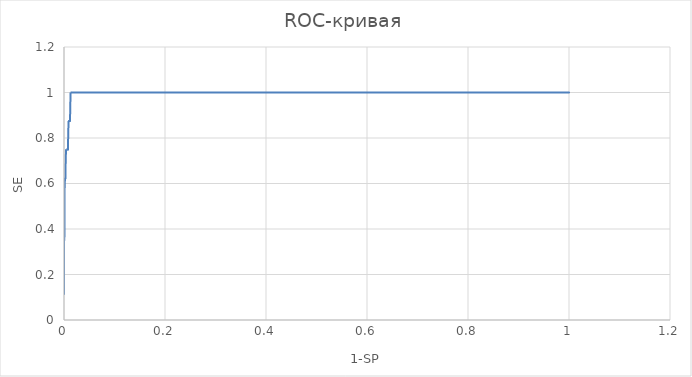
| Category | SE |
|---|---|
| 0.0 | 0.111 |
| 0.0 | 0.222 |
| 0.0 | 0.333 |
| 0.0010000000000000009 | 0.375 |
| 0.0010000000000000009 | 0.444 |
| 0.0010000000000000009 | 0.556 |
| 0.0020000000000000018 | 0.625 |
| 0.0030000000000000027 | 0.625 |
| 0.0030000000000000027 | 0.625 |
| 0.0030000000000000027 | 0.667 |
| 0.0040000000000000036 | 0.75 |
| 0.0050000000000000044 | 0.75 |
| 0.006000000000000005 | 0.75 |
| 0.007000000000000006 | 0.75 |
| 0.008000000000000007 | 0.75 |
| 0.008000000000000007 | 0.778 |
| 0.009000000000000008 | 0.875 |
| 0.010000000000000009 | 0.875 |
| 0.010000000000000009 | 0.875 |
| 0.01100000000000001 | 0.875 |
| 0.01200000000000001 | 0.875 |
| 0.01200000000000001 | 0.889 |
| 0.013000000000000012 | 1 |
| 0.014000000000000012 | 1 |
| 0.015000000000000013 | 1 |
| 0.016000000000000014 | 1 |
| 0.016000000000000014 | 1 |
| 0.017000000000000015 | 1 |
| 0.018000000000000016 | 1 |
| 0.019000000000000017 | 1 |
| 0.020000000000000018 | 1 |
| 0.02100000000000002 | 1 |
| 0.02200000000000002 | 1 |
| 0.02200000000000002 | 1 |
| 0.02300000000000002 | 1 |
| 0.02400000000000002 | 1 |
| 0.025000000000000022 | 1 |
| 0.026000000000000023 | 1 |
| 0.027000000000000024 | 1 |
| 0.028000000000000025 | 1 |
| 0.029000000000000026 | 1 |
| 0.029000000000000026 | 1 |
| 0.030000000000000027 | 1 |
| 0.031000000000000028 | 1 |
| 0.03200000000000003 | 1 |
| 0.03300000000000003 | 1 |
| 0.03400000000000003 | 1 |
| 0.03500000000000003 | 1 |
| 0.03500000000000003 | 1 |
| 0.03600000000000003 | 1 |
| 0.03700000000000003 | 1 |
| 0.038000000000000034 | 1 |
| 0.039000000000000035 | 1 |
| 0.040000000000000036 | 1 |
| 0.041000000000000036 | 1 |
| 0.041000000000000036 | 1 |
| 0.04200000000000004 | 1 |
| 0.04300000000000004 | 1 |
| 0.04400000000000004 | 1 |
| 0.04500000000000004 | 1 |
| 0.04600000000000004 | 1 |
| 0.04700000000000004 | 1 |
| 0.04800000000000004 | 1 |
| 0.04800000000000004 | 1 |
| 0.049000000000000044 | 1 |
| 0.050000000000000044 | 1 |
| 0.051000000000000045 | 1 |
| 0.052000000000000046 | 1 |
| 0.05300000000000005 | 1 |
| 0.05400000000000005 | 1 |
| 0.05400000000000005 | 1 |
| 0.05500000000000005 | 1 |
| 0.05600000000000005 | 1 |
| 0.05700000000000005 | 1 |
| 0.05800000000000005 | 1 |
| 0.05900000000000005 | 1 |
| 0.06000000000000005 | 1 |
| 0.061000000000000054 | 1 |
| 0.061000000000000054 | 1 |
| 0.062000000000000055 | 1 |
| 0.06299999999999994 | 1 |
| 0.06399999999999995 | 1 |
| 0.06499999999999995 | 1 |
| 0.06599999999999995 | 1 |
| 0.06699999999999995 | 1 |
| 0.06699999999999995 | 1 |
| 0.06799999999999995 | 1 |
| 0.06899999999999995 | 1 |
| 0.06999999999999995 | 1 |
| 0.07099999999999995 | 1 |
| 0.07199999999999995 | 1 |
| 0.07299999999999995 | 1 |
| 0.07299999999999995 | 1 |
| 0.07399999999999995 | 1 |
| 0.07499999999999996 | 1 |
| 0.07599999999999996 | 1 |
| 0.07699999999999996 | 1 |
| 0.07799999999999996 | 1 |
| 0.07899999999999996 | 1 |
| 0.07999999999999996 | 1 |
| 0.07999999999999996 | 1 |
| 0.08099999999999996 | 1 |
| 0.08199999999999996 | 1 |
| 0.08299999999999996 | 1 |
| 0.08399999999999996 | 1 |
| 0.08499999999999996 | 1 |
| 0.08599999999999997 | 1 |
| 0.08599999999999997 | 1 |
| 0.08699999999999997 | 1 |
| 0.08799999999999997 | 1 |
| 0.08899999999999997 | 1 |
| 0.08999999999999997 | 1 |
| 0.09099999999999997 | 1 |
| 0.09199999999999997 | 1 |
| 0.09199999999999997 | 1 |
| 0.09299999999999997 | 1 |
| 0.09399999999999997 | 1 |
| 0.09499999999999997 | 1 |
| 0.09599999999999997 | 1 |
| 0.09699999999999998 | 1 |
| 0.09799999999999998 | 1 |
| 0.09899999999999998 | 1 |
| 0.09899999999999998 | 1 |
| 0.09999999999999998 | 1 |
| 0.10099999999999998 | 1 |
| 0.10199999999999998 | 1 |
| 0.10299999999999998 | 1 |
| 0.10399999999999998 | 1 |
| 0.10499999999999998 | 1 |
| 0.10499999999999998 | 1 |
| 0.10599999999999998 | 1 |
| 0.10699999999999998 | 1 |
| 0.10799999999999998 | 1 |
| 0.10899999999999999 | 1 |
| 0.10999999999999999 | 1 |
| 0.11099999999999999 | 1 |
| 0.11099999999999999 | 1 |
| 0.11199999999999999 | 1 |
| 0.11299999999999999 | 1 |
| 0.11399999999999999 | 1 |
| 0.11499999999999999 | 1 |
| 0.11599999999999999 | 1 |
| 0.11699999999999999 | 1 |
| 0.118 | 1 |
| 0.118 | 1 |
| 0.119 | 1 |
| 0.12 | 1 |
| 0.121 | 1 |
| 0.122 | 1 |
| 0.123 | 1 |
| 0.124 | 1 |
| 0.124 | 1 |
| 0.125 | 1 |
| 0.126 | 1 |
| 0.127 | 1 |
| 0.128 | 1 |
| 0.129 | 1 |
| 0.13 | 1 |
| 0.131 | 1 |
| 0.131 | 1 |
| 0.132 | 1 |
| 0.133 | 1 |
| 0.134 | 1 |
| 0.135 | 1 |
| 0.136 | 1 |
| 0.137 | 1 |
| 0.137 | 1 |
| 0.138 | 1 |
| 0.139 | 1 |
| 0.14 | 1 |
| 0.14100000000000001 | 1 |
| 0.14200000000000002 | 1 |
| 0.14300000000000002 | 1 |
| 0.14300000000000002 | 1 |
| 0.14400000000000002 | 1 |
| 0.14500000000000002 | 1 |
| 0.14600000000000002 | 1 |
| 0.14700000000000002 | 1 |
| 0.14800000000000002 | 1 |
| 0.14900000000000002 | 1 |
| 0.15000000000000002 | 1 |
| 0.15000000000000002 | 1 |
| 0.15100000000000002 | 1 |
| 0.15200000000000002 | 1 |
| 0.15300000000000002 | 1 |
| 0.15400000000000003 | 1 |
| 0.15500000000000003 | 1 |
| 0.15600000000000003 | 1 |
| 0.15600000000000003 | 1 |
| 0.15700000000000003 | 1 |
| 0.15800000000000003 | 1 |
| 0.15900000000000003 | 1 |
| 0.16000000000000003 | 1 |
| 0.16100000000000003 | 1 |
| 0.16200000000000003 | 1 |
| 0.16200000000000003 | 1 |
| 0.16300000000000003 | 1 |
| 0.16400000000000003 | 1 |
| 0.16500000000000004 | 1 |
| 0.16600000000000004 | 1 |
| 0.16700000000000004 | 1 |
| 0.16800000000000004 | 1 |
| 0.16900000000000004 | 1 |
| 0.16900000000000004 | 1 |
| 0.17000000000000004 | 1 |
| 0.17100000000000004 | 1 |
| 0.17200000000000004 | 1 |
| 0.17300000000000004 | 1 |
| 0.17400000000000004 | 1 |
| 0.17500000000000004 | 1 |
| 0.17500000000000004 | 1 |
| 0.17600000000000005 | 1 |
| 0.17700000000000005 | 1 |
| 0.17800000000000005 | 1 |
| 0.17900000000000005 | 1 |
| 0.18000000000000005 | 1 |
| 0.18100000000000005 | 1 |
| 0.18200000000000005 | 1 |
| 0.18200000000000005 | 1 |
| 0.18300000000000005 | 1 |
| 0.18400000000000005 | 1 |
| 0.18500000000000005 | 1 |
| 0.18600000000000005 | 1 |
| 0.18700000000000006 | 1 |
| 0.18799999999999994 | 1 |
| 0.18799999999999994 | 1 |
| 0.18899999999999995 | 1 |
| 0.18999999999999995 | 1 |
| 0.19099999999999995 | 1 |
| 0.19199999999999995 | 1 |
| 0.19299999999999995 | 1 |
| 0.19399999999999995 | 1 |
| 0.19399999999999995 | 1 |
| 0.19499999999999995 | 1 |
| 0.19599999999999995 | 1 |
| 0.19699999999999995 | 1 |
| 0.19799999999999995 | 1 |
| 0.19899999999999995 | 1 |
| 0.19999999999999996 | 1 |
| 0.20099999999999996 | 1 |
| 0.20099999999999996 | 1 |
| 0.20199999999999996 | 1 |
| 0.20299999999999996 | 1 |
| 0.20399999999999996 | 1 |
| 0.20499999999999996 | 1 |
| 0.20599999999999996 | 1 |
| 0.20699999999999996 | 1 |
| 0.20699999999999996 | 1 |
| 0.20799999999999996 | 1 |
| 0.20899999999999996 | 1 |
| 0.20999999999999996 | 1 |
| 0.21099999999999997 | 1 |
| 0.21199999999999997 | 1 |
| 0.21299999999999997 | 1 |
| 0.21299999999999997 | 1 |
| 0.21399999999999997 | 1 |
| 0.21499999999999997 | 1 |
| 0.21599999999999997 | 1 |
| 0.21699999999999997 | 1 |
| 0.21799999999999997 | 1 |
| 0.21899999999999997 | 1 |
| 0.21999999999999997 | 1 |
| 0.21999999999999997 | 1 |
| 0.22099999999999997 | 1 |
| 0.22199999999999998 | 1 |
| 0.22299999999999998 | 1 |
| 0.22399999999999998 | 1 |
| 0.22499999999999998 | 1 |
| 0.22599999999999998 | 1 |
| 0.22599999999999998 | 1 |
| 0.22699999999999998 | 1 |
| 0.22799999999999998 | 1 |
| 0.22899999999999998 | 1 |
| 0.22999999999999998 | 1 |
| 0.23099999999999998 | 1 |
| 0.23199999999999998 | 1 |
| 0.23199999999999998 | 1 |
| 0.23299999999999998 | 1 |
| 0.23399999999999999 | 1 |
| 0.235 | 1 |
| 0.236 | 1 |
| 0.237 | 1 |
| 0.238 | 1 |
| 0.239 | 1 |
| 0.239 | 1 |
| 0.24 | 1 |
| 0.241 | 1 |
| 0.242 | 1 |
| 0.243 | 1 |
| 0.244 | 1 |
| 0.245 | 1 |
| 0.245 | 1 |
| 0.246 | 1 |
| 0.247 | 1 |
| 0.248 | 1 |
| 0.249 | 1 |
| 0.25 | 1 |
| 0.251 | 1 |
| 0.252 | 1 |
| 0.252 | 1 |
| 0.253 | 1 |
| 0.254 | 1 |
| 0.255 | 1 |
| 0.256 | 1 |
| 0.257 | 1 |
| 0.258 | 1 |
| 0.258 | 1 |
| 0.259 | 1 |
| 0.26 | 1 |
| 0.261 | 1 |
| 0.262 | 1 |
| 0.263 | 1 |
| 0.264 | 1 |
| 0.264 | 1 |
| 0.265 | 1 |
| 0.266 | 1 |
| 0.267 | 1 |
| 0.268 | 1 |
| 0.269 | 1 |
| 0.27 | 1 |
| 0.271 | 1 |
| 0.271 | 1 |
| 0.272 | 1 |
| 0.273 | 1 |
| 0.274 | 1 |
| 0.275 | 1 |
| 0.276 | 1 |
| 0.277 | 1 |
| 0.277 | 1 |
| 0.278 | 1 |
| 0.279 | 1 |
| 0.28 | 1 |
| 0.281 | 1 |
| 0.28200000000000003 | 1 |
| 0.28300000000000003 | 1 |
| 0.28300000000000003 | 1 |
| 0.28400000000000003 | 1 |
| 0.28500000000000003 | 1 |
| 0.28600000000000003 | 1 |
| 0.28700000000000003 | 1 |
| 0.28800000000000003 | 1 |
| 0.28900000000000003 | 1 |
| 0.29000000000000004 | 1 |
| 0.29000000000000004 | 1 |
| 0.29100000000000004 | 1 |
| 0.29200000000000004 | 1 |
| 0.29300000000000004 | 1 |
| 0.29400000000000004 | 1 |
| 0.29500000000000004 | 1 |
| 0.29600000000000004 | 1 |
| 0.29600000000000004 | 1 |
| 0.29700000000000004 | 1 |
| 0.29800000000000004 | 1 |
| 0.29900000000000004 | 1 |
| 0.30000000000000004 | 1 |
| 0.30100000000000005 | 1 |
| 0.30200000000000005 | 1 |
| 0.30300000000000005 | 1 |
| 0.30300000000000005 | 1 |
| 0.30400000000000005 | 1 |
| 0.30500000000000005 | 1 |
| 0.30600000000000005 | 1 |
| 0.30700000000000005 | 1 |
| 0.30800000000000005 | 1 |
| 0.30900000000000005 | 1 |
| 0.30900000000000005 | 1 |
| 0.31000000000000005 | 1 |
| 0.31100000000000005 | 1 |
| 0.31200000000000006 | 1 |
| 0.31299999999999994 | 1 |
| 0.31399999999999995 | 1 |
| 0.31499999999999995 | 1 |
| 0.31499999999999995 | 1 |
| 0.31599999999999995 | 1 |
| 0.31699999999999995 | 1 |
| 0.31799999999999995 | 1 |
| 0.31899999999999995 | 1 |
| 0.31999999999999995 | 1 |
| 0.32099999999999995 | 1 |
| 0.32199999999999995 | 1 |
| 0.32199999999999995 | 1 |
| 0.32299999999999995 | 1 |
| 0.32399999999999995 | 1 |
| 0.32499999999999996 | 1 |
| 0.32599999999999996 | 1 |
| 0.32699999999999996 | 1 |
| 0.32799999999999996 | 1 |
| 0.32799999999999996 | 1 |
| 0.32899999999999996 | 1 |
| 0.32999999999999996 | 1 |
| 0.33099999999999996 | 1 |
| 0.33199999999999996 | 1 |
| 0.33299999999999996 | 1 |
| 0.33399999999999996 | 1 |
| 0.33399999999999996 | 1 |
| 0.33499999999999996 | 1 |
| 0.33599999999999997 | 1 |
| 0.33699999999999997 | 1 |
| 0.33799999999999997 | 1 |
| 0.33899999999999997 | 1 |
| 0.33999999999999997 | 1 |
| 0.34099999999999997 | 1 |
| 0.34099999999999997 | 1 |
| 0.34199999999999997 | 1 |
| 0.34299999999999997 | 1 |
| 0.344 | 1 |
| 0.345 | 1 |
| 0.346 | 1 |
| 0.347 | 1 |
| 0.347 | 1 |
| 0.348 | 1 |
| 0.349 | 1 |
| 0.35 | 1 |
| 0.351 | 1 |
| 0.352 | 1 |
| 0.353 | 1 |
| 0.354 | 1 |
| 0.354 | 1 |
| 0.355 | 1 |
| 0.356 | 1 |
| 0.357 | 1 |
| 0.358 | 1 |
| 0.359 | 1 |
| 0.36 | 1 |
| 0.36 | 1 |
| 0.361 | 1 |
| 0.362 | 1 |
| 0.363 | 1 |
| 0.364 | 1 |
| 0.365 | 1 |
| 0.366 | 1 |
| 0.366 | 1 |
| 0.367 | 1 |
| 0.368 | 1 |
| 0.369 | 1 |
| 0.37 | 1 |
| 0.371 | 1 |
| 0.372 | 1 |
| 0.373 | 1 |
| 0.373 | 1 |
| 0.374 | 1 |
| 0.375 | 1 |
| 0.376 | 1 |
| 0.377 | 1 |
| 0.378 | 1 |
| 0.379 | 1 |
| 0.379 | 1 |
| 0.38 | 1 |
| 0.381 | 1 |
| 0.382 | 1 |
| 0.383 | 1 |
| 0.384 | 1 |
| 0.385 | 1 |
| 0.385 | 1 |
| 0.386 | 1 |
| 0.387 | 1 |
| 0.388 | 1 |
| 0.389 | 1 |
| 0.39 | 1 |
| 0.391 | 1 |
| 0.392 | 1 |
| 0.392 | 1 |
| 0.393 | 1 |
| 0.394 | 1 |
| 0.395 | 1 |
| 0.396 | 1 |
| 0.397 | 1 |
| 0.398 | 1 |
| 0.398 | 1 |
| 0.399 | 1 |
| 0.4 | 1 |
| 0.401 | 1 |
| 0.402 | 1 |
| 0.403 | 1 |
| 0.404 | 1 |
| 0.404 | 1 |
| 0.405 | 1 |
| 0.406 | 1 |
| 0.40700000000000003 | 1 |
| 0.40800000000000003 | 1 |
| 0.40900000000000003 | 1 |
| 0.41000000000000003 | 1 |
| 0.41100000000000003 | 1 |
| 0.41100000000000003 | 1 |
| 0.41200000000000003 | 1 |
| 0.41300000000000003 | 1 |
| 0.41400000000000003 | 1 |
| 0.41500000000000004 | 1 |
| 0.41600000000000004 | 1 |
| 0.41700000000000004 | 1 |
| 0.41700000000000004 | 1 |
| 0.41800000000000004 | 1 |
| 0.41900000000000004 | 1 |
| 0.42000000000000004 | 1 |
| 0.42100000000000004 | 1 |
| 0.42200000000000004 | 1 |
| 0.42300000000000004 | 1 |
| 0.42400000000000004 | 1 |
| 0.42400000000000004 | 1 |
| 0.42500000000000004 | 1 |
| 0.42600000000000005 | 1 |
| 0.42700000000000005 | 1 |
| 0.42800000000000005 | 1 |
| 0.42900000000000005 | 1 |
| 0.43000000000000005 | 1 |
| 0.43000000000000005 | 1 |
| 0.43100000000000005 | 1 |
| 0.43200000000000005 | 1 |
| 0.43300000000000005 | 1 |
| 0.43400000000000005 | 1 |
| 0.43500000000000005 | 1 |
| 0.43600000000000005 | 1 |
| 0.43600000000000005 | 1 |
| 0.43700000000000006 | 1 |
| 0.43799999999999994 | 1 |
| 0.43899999999999995 | 1 |
| 0.43999999999999995 | 1 |
| 0.44099999999999995 | 1 |
| 0.44199999999999995 | 1 |
| 0.44299999999999995 | 1 |
| 0.44299999999999995 | 1 |
| 0.44399999999999995 | 1 |
| 0.44499999999999995 | 1 |
| 0.44599999999999995 | 1 |
| 0.44699999999999995 | 1 |
| 0.44799999999999995 | 1 |
| 0.44899999999999995 | 1 |
| 0.44899999999999995 | 1 |
| 0.44999999999999996 | 1 |
| 0.45099999999999996 | 1 |
| 0.45199999999999996 | 1 |
| 0.45299999999999996 | 1 |
| 0.45399999999999996 | 1 |
| 0.45499999999999996 | 1 |
| 0.45499999999999996 | 1 |
| 0.45599999999999996 | 1 |
| 0.45699999999999996 | 1 |
| 0.45799999999999996 | 1 |
| 0.45899999999999996 | 1 |
| 0.45999999999999996 | 1 |
| 0.46099999999999997 | 1 |
| 0.46199999999999997 | 1 |
| 0.46199999999999997 | 1 |
| 0.46299999999999997 | 1 |
| 0.46399999999999997 | 1 |
| 0.46499999999999997 | 1 |
| 0.46599999999999997 | 1 |
| 0.46699999999999997 | 1 |
| 0.46799999999999997 | 1 |
| 0.46799999999999997 | 1 |
| 0.469 | 1 |
| 0.47 | 1 |
| 0.471 | 1 |
| 0.472 | 1 |
| 0.473 | 1 |
| 0.474 | 1 |
| 0.475 | 1 |
| 0.475 | 1 |
| 0.476 | 1 |
| 0.477 | 1 |
| 0.478 | 1 |
| 0.479 | 1 |
| 0.48 | 1 |
| 0.481 | 1 |
| 0.481 | 1 |
| 0.482 | 1 |
| 0.483 | 1 |
| 0.484 | 1 |
| 0.485 | 1 |
| 0.486 | 1 |
| 0.487 | 1 |
| 0.487 | 1 |
| 0.488 | 1 |
| 0.489 | 1 |
| 0.49 | 1 |
| 0.491 | 1 |
| 0.492 | 1 |
| 0.493 | 1 |
| 0.494 | 1 |
| 0.494 | 1 |
| 0.495 | 1 |
| 0.496 | 1 |
| 0.497 | 1 |
| 0.498 | 1 |
| 0.499 | 1 |
| 0.5 | 1 |
| 0.5 | 1 |
| 0.501 | 1 |
| 0.502 | 1 |
| 0.503 | 1 |
| 0.504 | 1 |
| 0.505 | 1 |
| 0.506 | 1 |
| 0.506 | 1 |
| 0.507 | 1 |
| 0.508 | 1 |
| 0.509 | 1 |
| 0.51 | 1 |
| 0.511 | 1 |
| 0.512 | 1 |
| 0.513 | 1 |
| 0.513 | 1 |
| 0.514 | 1 |
| 0.515 | 1 |
| 0.516 | 1 |
| 0.517 | 1 |
| 0.518 | 1 |
| 0.519 | 1 |
| 0.519 | 1 |
| 0.52 | 1 |
| 0.521 | 1 |
| 0.522 | 1 |
| 0.523 | 1 |
| 0.524 | 1 |
| 0.525 | 1 |
| 0.525 | 1 |
| 0.526 | 1 |
| 0.527 | 1 |
| 0.528 | 1 |
| 0.529 | 1 |
| 0.53 | 1 |
| 0.531 | 1 |
| 0.532 | 1 |
| 0.532 | 1 |
| 0.5329999999999999 | 1 |
| 0.534 | 1 |
| 0.5349999999999999 | 1 |
| 0.536 | 1 |
| 0.5369999999999999 | 1 |
| 0.538 | 1 |
| 0.538 | 1 |
| 0.5389999999999999 | 1 |
| 0.54 | 1 |
| 0.5409999999999999 | 1 |
| 0.542 | 1 |
| 0.5429999999999999 | 1 |
| 0.544 | 1 |
| 0.5449999999999999 | 1 |
| 0.5449999999999999 | 1 |
| 0.546 | 1 |
| 0.5469999999999999 | 1 |
| 0.548 | 1 |
| 0.5489999999999999 | 1 |
| 0.55 | 1 |
| 0.5509999999999999 | 1 |
| 0.5509999999999999 | 1 |
| 0.552 | 1 |
| 0.5529999999999999 | 1 |
| 0.554 | 1 |
| 0.5549999999999999 | 1 |
| 0.556 | 1 |
| 0.5569999999999999 | 1 |
| 0.5569999999999999 | 1 |
| 0.558 | 1 |
| 0.5589999999999999 | 1 |
| 0.56 | 1 |
| 0.5609999999999999 | 1 |
| 0.562 | 1 |
| 0.563 | 1 |
| 0.5640000000000001 | 1 |
| 0.5640000000000001 | 1 |
| 0.565 | 1 |
| 0.5660000000000001 | 1 |
| 0.567 | 1 |
| 0.5680000000000001 | 1 |
| 0.569 | 1 |
| 0.5700000000000001 | 1 |
| 0.5700000000000001 | 1 |
| 0.571 | 1 |
| 0.5720000000000001 | 1 |
| 0.573 | 1 |
| 0.5740000000000001 | 1 |
| 0.575 | 1 |
| 0.5760000000000001 | 1 |
| 0.5760000000000001 | 1 |
| 0.577 | 1 |
| 0.5780000000000001 | 1 |
| 0.579 | 1 |
| 0.5800000000000001 | 1 |
| 0.581 | 1 |
| 0.5820000000000001 | 1 |
| 0.583 | 1 |
| 0.583 | 1 |
| 0.5840000000000001 | 1 |
| 0.585 | 1 |
| 0.5860000000000001 | 1 |
| 0.587 | 1 |
| 0.5880000000000001 | 1 |
| 0.589 | 1 |
| 0.589 | 1 |
| 0.5900000000000001 | 1 |
| 0.591 | 1 |
| 0.5920000000000001 | 1 |
| 0.593 | 1 |
| 0.594 | 1 |
| 0.595 | 1 |
| 0.596 | 1 |
| 0.596 | 1 |
| 0.597 | 1 |
| 0.598 | 1 |
| 0.599 | 1 |
| 0.6 | 1 |
| 0.601 | 1 |
| 0.602 | 1 |
| 0.602 | 1 |
| 0.603 | 1 |
| 0.604 | 1 |
| 0.605 | 1 |
| 0.606 | 1 |
| 0.607 | 1 |
| 0.608 | 1 |
| 0.608 | 1 |
| 0.609 | 1 |
| 0.61 | 1 |
| 0.611 | 1 |
| 0.612 | 1 |
| 0.613 | 1 |
| 0.614 | 1 |
| 0.615 | 1 |
| 0.615 | 1 |
| 0.616 | 1 |
| 0.617 | 1 |
| 0.618 | 1 |
| 0.619 | 1 |
| 0.62 | 1 |
| 0.621 | 1 |
| 0.621 | 1 |
| 0.622 | 1 |
| 0.623 | 1 |
| 0.624 | 1 |
| 0.625 | 1 |
| 0.626 | 1 |
| 0.627 | 1 |
| 0.627 | 1 |
| 0.628 | 1 |
| 0.629 | 1 |
| 0.63 | 1 |
| 0.631 | 1 |
| 0.632 | 1 |
| 0.633 | 1 |
| 0.634 | 1 |
| 0.634 | 1 |
| 0.635 | 1 |
| 0.636 | 1 |
| 0.637 | 1 |
| 0.638 | 1 |
| 0.639 | 1 |
| 0.64 | 1 |
| 0.64 | 1 |
| 0.641 | 1 |
| 0.642 | 1 |
| 0.643 | 1 |
| 0.644 | 1 |
| 0.645 | 1 |
| 0.646 | 1 |
| 0.646 | 1 |
| 0.647 | 1 |
| 0.648 | 1 |
| 0.649 | 1 |
| 0.65 | 1 |
| 0.651 | 1 |
| 0.652 | 1 |
| 0.653 | 1 |
| 0.653 | 1 |
| 0.654 | 1 |
| 0.655 | 1 |
| 0.656 | 1 |
| 0.657 | 1 |
| 0.6579999999999999 | 1 |
| 0.659 | 1 |
| 0.659 | 1 |
| 0.6599999999999999 | 1 |
| 0.661 | 1 |
| 0.6619999999999999 | 1 |
| 0.663 | 1 |
| 0.6639999999999999 | 1 |
| 0.665 | 1 |
| 0.6659999999999999 | 1 |
| 0.6659999999999999 | 1 |
| 0.667 | 1 |
| 0.6679999999999999 | 1 |
| 0.669 | 1 |
| 0.6699999999999999 | 1 |
| 0.671 | 1 |
| 0.6719999999999999 | 1 |
| 0.6719999999999999 | 1 |
| 0.673 | 1 |
| 0.6739999999999999 | 1 |
| 0.675 | 1 |
| 0.6759999999999999 | 1 |
| 0.677 | 1 |
| 0.6779999999999999 | 1 |
| 0.6779999999999999 | 1 |
| 0.679 | 1 |
| 0.6799999999999999 | 1 |
| 0.681 | 1 |
| 0.6819999999999999 | 1 |
| 0.683 | 1 |
| 0.6839999999999999 | 1 |
| 0.685 | 1 |
| 0.685 | 1 |
| 0.6859999999999999 | 1 |
| 0.687 | 1 |
| 0.688 | 1 |
| 0.6890000000000001 | 1 |
| 0.69 | 1 |
| 0.6910000000000001 | 1 |
| 0.6910000000000001 | 1 |
| 0.692 | 1 |
| 0.6930000000000001 | 1 |
| 0.694 | 1 |
| 0.6950000000000001 | 1 |
| 0.696 | 1 |
| 0.6970000000000001 | 1 |
| 0.6970000000000001 | 1 |
| 0.698 | 1 |
| 0.6990000000000001 | 1 |
| 0.7 | 1 |
| 0.7010000000000001 | 1 |
| 0.702 | 1 |
| 0.7030000000000001 | 1 |
| 0.704 | 1 |
| 0.704 | 1 |
| 0.7050000000000001 | 1 |
| 0.706 | 1 |
| 0.7070000000000001 | 1 |
| 0.708 | 1 |
| 0.7090000000000001 | 1 |
| 0.71 | 1 |
| 0.71 | 1 |
| 0.7110000000000001 | 1 |
| 0.712 | 1 |
| 0.7130000000000001 | 1 |
| 0.714 | 1 |
| 0.7150000000000001 | 1 |
| 0.716 | 1 |
| 0.7170000000000001 | 1 |
| 0.7170000000000001 | 1 |
| 0.718 | 1 |
| 0.719 | 1 |
| 0.72 | 1 |
| 0.721 | 1 |
| 0.722 | 1 |
| 0.723 | 1 |
| 0.723 | 1 |
| 0.724 | 1 |
| 0.725 | 1 |
| 0.726 | 1 |
| 0.727 | 1 |
| 0.728 | 1 |
| 0.729 | 1 |
| 0.729 | 1 |
| 0.73 | 1 |
| 0.731 | 1 |
| 0.732 | 1 |
| 0.733 | 1 |
| 0.734 | 1 |
| 0.735 | 1 |
| 0.736 | 1 |
| 0.736 | 1 |
| 0.737 | 1 |
| 0.738 | 1 |
| 0.739 | 1 |
| 0.74 | 1 |
| 0.741 | 1 |
| 0.742 | 1 |
| 0.742 | 1 |
| 0.743 | 1 |
| 0.744 | 1 |
| 0.745 | 1 |
| 0.746 | 1 |
| 0.747 | 1 |
| 0.748 | 1 |
| 0.748 | 1 |
| 0.749 | 1 |
| 0.75 | 1 |
| 0.751 | 1 |
| 0.752 | 1 |
| 0.753 | 1 |
| 0.754 | 1 |
| 0.755 | 1 |
| 0.755 | 1 |
| 0.756 | 1 |
| 0.757 | 1 |
| 0.758 | 1 |
| 0.759 | 1 |
| 0.76 | 1 |
| 0.761 | 1 |
| 0.761 | 1 |
| 0.762 | 1 |
| 0.763 | 1 |
| 0.764 | 1 |
| 0.765 | 1 |
| 0.766 | 1 |
| 0.767 | 1 |
| 0.768 | 1 |
| 0.768 | 1 |
| 0.769 | 1 |
| 0.77 | 1 |
| 0.771 | 1 |
| 0.772 | 1 |
| 0.773 | 1 |
| 0.774 | 1 |
| 0.774 | 1 |
| 0.775 | 1 |
| 0.776 | 1 |
| 0.777 | 1 |
| 0.778 | 1 |
| 0.779 | 1 |
| 0.78 | 1 |
| 0.78 | 1 |
| 0.781 | 1 |
| 0.782 | 1 |
| 0.783 | 1 |
| 0.784 | 1 |
| 0.785 | 1 |
| 0.786 | 1 |
| 0.787 | 1 |
| 0.787 | 1 |
| 0.788 | 1 |
| 0.789 | 1 |
| 0.79 | 1 |
| 0.791 | 1 |
| 0.792 | 1 |
| 0.793 | 1 |
| 0.793 | 1 |
| 0.794 | 1 |
| 0.795 | 1 |
| 0.796 | 1 |
| 0.7969999999999999 | 1 |
| 0.798 | 1 |
| 0.7989999999999999 | 1 |
| 0.7989999999999999 | 1 |
| 0.8 | 1 |
| 0.8009999999999999 | 1 |
| 0.802 | 1 |
| 0.8029999999999999 | 1 |
| 0.804 | 1 |
| 0.8049999999999999 | 1 |
| 0.806 | 1 |
| 0.806 | 1 |
| 0.8069999999999999 | 1 |
| 0.808 | 1 |
| 0.8089999999999999 | 1 |
| 0.81 | 1 |
| 0.8109999999999999 | 1 |
| 0.812 | 1 |
| 0.812 | 1 |
| 0.813 | 1 |
| 0.8140000000000001 | 1 |
| 0.815 | 1 |
| 0.8160000000000001 | 1 |
| 0.817 | 1 |
| 0.8180000000000001 | 1 |
| 0.8180000000000001 | 1 |
| 0.819 | 1 |
| 0.8200000000000001 | 1 |
| 0.821 | 1 |
| 0.8220000000000001 | 1 |
| 0.823 | 1 |
| 0.8240000000000001 | 1 |
| 0.825 | 1 |
| 0.825 | 1 |
| 0.8260000000000001 | 1 |
| 0.827 | 1 |
| 0.8280000000000001 | 1 |
| 0.829 | 1 |
| 0.83 | 1 |
| 0.831 | 1 |
| 0.831 | 1 |
| 0.832 | 1 |
| 0.833 | 1 |
| 0.834 | 1 |
| 0.835 | 1 |
| 0.836 | 1 |
| 0.837 | 1 |
| 0.838 | 1 |
| 0.838 | 1 |
| 0.839 | 1 |
| 0.84 | 1 |
| 0.841 | 1 |
| 0.842 | 1 |
| 0.843 | 1 |
| 0.844 | 1 |
| 0.844 | 1 |
| 0.845 | 1 |
| 0.846 | 1 |
| 0.847 | 1 |
| 0.848 | 1 |
| 0.849 | 1 |
| 0.85 | 1 |
| 0.85 | 1 |
| 0.851 | 1 |
| 0.852 | 1 |
| 0.853 | 1 |
| 0.854 | 1 |
| 0.855 | 1 |
| 0.856 | 1 |
| 0.857 | 1 |
| 0.857 | 1 |
| 0.858 | 1 |
| 0.859 | 1 |
| 0.86 | 1 |
| 0.861 | 1 |
| 0.862 | 1 |
| 0.863 | 1 |
| 0.863 | 1 |
| 0.864 | 1 |
| 0.865 | 1 |
| 0.866 | 1 |
| 0.867 | 1 |
| 0.868 | 1 |
| 0.869 | 1 |
| 0.869 | 1 |
| 0.87 | 1 |
| 0.871 | 1 |
| 0.872 | 1 |
| 0.873 | 1 |
| 0.874 | 1 |
| 0.875 | 1 |
| 0.876 | 1 |
| 0.876 | 1 |
| 0.877 | 1 |
| 0.878 | 1 |
| 0.879 | 1 |
| 0.88 | 1 |
| 0.881 | 1 |
| 0.882 | 1 |
| 0.882 | 1 |
| 0.883 | 1 |
| 0.884 | 1 |
| 0.885 | 1 |
| 0.886 | 1 |
| 0.887 | 1 |
| 0.888 | 1 |
| 0.889 | 1 |
| 0.889 | 1 |
| 0.89 | 1 |
| 0.891 | 1 |
| 0.892 | 1 |
| 0.893 | 1 |
| 0.894 | 1 |
| 0.895 | 1 |
| 0.895 | 1 |
| 0.896 | 1 |
| 0.897 | 1 |
| 0.898 | 1 |
| 0.899 | 1 |
| 0.9 | 1 |
| 0.901 | 1 |
| 0.901 | 1 |
| 0.902 | 1 |
| 0.903 | 1 |
| 0.904 | 1 |
| 0.905 | 1 |
| 0.906 | 1 |
| 0.907 | 1 |
| 0.908 | 1 |
| 0.908 | 1 |
| 0.909 | 1 |
| 0.91 | 1 |
| 0.911 | 1 |
| 0.912 | 1 |
| 0.913 | 1 |
| 0.914 | 1 |
| 0.914 | 1 |
| 0.915 | 1 |
| 0.916 | 1 |
| 0.917 | 1 |
| 0.918 | 1 |
| 0.919 | 1 |
| 0.92 | 1 |
| 0.92 | 1 |
| 0.921 | 1 |
| 0.922 | 1 |
| 0.923 | 1 |
| 0.924 | 1 |
| 0.925 | 1 |
| 0.926 | 1 |
| 0.927 | 1 |
| 0.927 | 1 |
| 0.928 | 1 |
| 0.929 | 1 |
| 0.9299999999999999 | 1 |
| 0.931 | 1 |
| 0.9319999999999999 | 1 |
| 0.933 | 1 |
| 0.933 | 1 |
| 0.9339999999999999 | 1 |
| 0.935 | 1 |
| 0.9359999999999999 | 1 |
| 0.937 | 1 |
| 0.938 | 1 |
| 0.9390000000000001 | 1 |
| 0.9390000000000001 | 1 |
| 0.94 | 1 |
| 0.9410000000000001 | 1 |
| 0.942 | 1 |
| 0.943 | 1 |
| 0.944 | 1 |
| 0.945 | 1 |
| 0.946 | 1 |
| 0.946 | 1 |
| 0.947 | 1 |
| 0.948 | 1 |
| 0.949 | 1 |
| 0.95 | 1 |
| 0.951 | 1 |
| 0.952 | 1 |
| 0.952 | 1 |
| 0.953 | 1 |
| 0.954 | 1 |
| 0.955 | 1 |
| 0.956 | 1 |
| 0.957 | 1 |
| 0.958 | 1 |
| 0.959 | 1 |
| 0.959 | 1 |
| 0.96 | 1 |
| 0.961 | 1 |
| 0.962 | 1 |
| 0.963 | 1 |
| 0.964 | 1 |
| 0.965 | 1 |
| 0.965 | 1 |
| 0.966 | 1 |
| 0.967 | 1 |
| 0.968 | 1 |
| 0.969 | 1 |
| 0.97 | 1 |
| 0.971 | 1 |
| 0.971 | 1 |
| 0.972 | 1 |
| 0.973 | 1 |
| 0.974 | 1 |
| 0.975 | 1 |
| 0.976 | 1 |
| 0.977 | 1 |
| 0.978 | 1 |
| 0.978 | 1 |
| 0.979 | 1 |
| 0.98 | 1 |
| 0.981 | 1 |
| 0.982 | 1 |
| 0.983 | 1 |
| 0.984 | 1 |
| 0.984 | 1 |
| 0.985 | 1 |
| 0.986 | 1 |
| 0.987 | 1 |
| 0.988 | 1 |
| 0.989 | 1 |
| 0.99 | 1 |
| 0.99 | 1 |
| 0.991 | 1 |
| 0.992 | 1 |
| 0.993 | 1 |
| 0.994 | 1 |
| 0.995 | 1 |
| 0.996 | 1 |
| 0.997 | 1 |
| 0.997 | 1 |
| 0.998 | 1 |
| 0.999 | 1 |
| 1.0 | 1 |
| 1.0 | 1 |
| 1.0 | 1 |
| 1.0 | 1 |
| 1.0 | 1 |
| 1.0 | 1 |
| 1.0 | 1 |
| 1.0 | 1 |
| 1.0 | 1 |
| 1.0 | 1 |
| 1.0 | 1 |
| 1.0 | 1 |
| 1.0 | 1 |
| 1.0 | 1 |
| 1.0 | 1 |
| 1.0 | 1 |
| 1.0 | 1 |
| 1.0 | 1 |
| 1.0 | 1 |
| 1.0 | 1 |
| 1.0 | 1 |
| 1.0 | 1 |
| 1.0 | 1 |
| 1.0 | 1 |
| 1.0 | 1 |
| 1.0 | 1 |
| 1.0 | 1 |
| 1.0 | 1 |
| 1.0 | 1 |
| 1.0 | 1 |
| 1.0 | 1 |
| 1.0 | 1 |
| 1.0 | 1 |
| 1.0 | 1 |
| 1.0 | 1 |
| 1.0 | 1 |
| 1.0 | 1 |
| 1.0 | 1 |
| 1.0 | 1 |
| 1.0 | 1 |
| 1.0 | 1 |
| 1.0 | 1 |